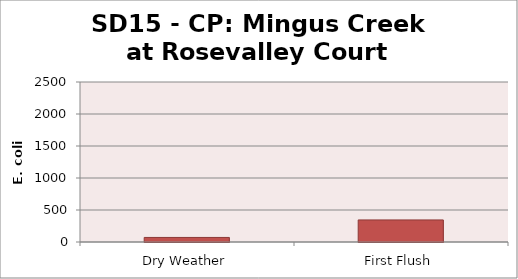
| Category | E. coli MPN |
|---|---|
| Dry Weather | 71.2 |
| First Flush | 344.8 |